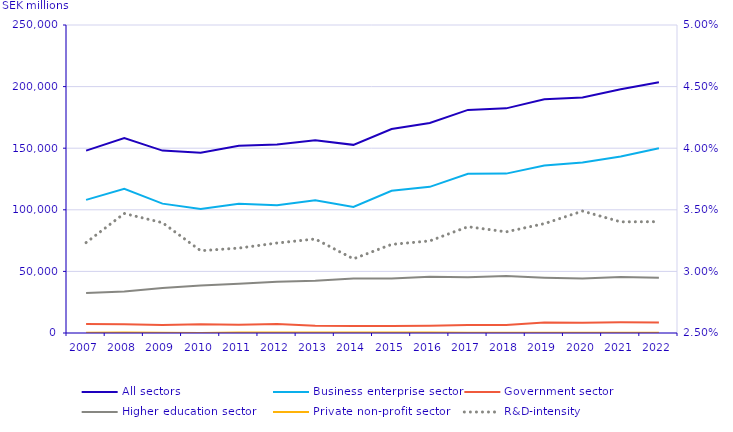
| Category | All sectors | Business enterprise sector | Government sector | Higher education sector | Private non-profit sector |
|---|---|---|---|---|---|
| 2007 | 148064.803 | 108048.556 | 7315.673 | 32453.731 | 246.844 |
| 2008 | 158165.206 | 117124.137 | 7023.628 | 33707.536 | 309.905 |
| 2009 | 148042.103 | 105006.653 | 6471.565 | 36454.263 | 109.621 |
| 2010 | 146349.97 | 100610.676 | 7129.595 | 38559.281 | 50.418 |
| 2011 | 152041.988 | 104949.767 | 6652.556 | 39956.261 | 483.404 |
| 2012 | 153093.454 | 103778.803 | 7352.629 | 41513.8 | 448.223 |
| 2013 | 156486.555 | 107806.951 | 5857.41 | 42470.925 | 351.269 |
| 2014 | 152707.249 | 102379.01 | 5721.22 | 44239.579 | 367.44 |
| 2015 | 165595.104 | 115399.439 | 5661.546 | 44227.436 | 306.682 |
| 2016 | 170507.534 | 118642.427 | 5804.81 | 45729.68 | 330.616 |
| 2017 | 181102.219 | 129170.926 | 6559.093 | 45156.785 | 215.415 |
| 2018 | 182342.868 | 129374.5 | 6594.323 | 46168.221 | 205.824 |
| 2019 | 189689.467 | 136008.434 | 8559.646 | 44900.714 | 220.672 |
| 2020 | 191161.528 | 138302.77 | 8403.17 | 44232.706 | 222.881 |
| 2021 | 197828.192 | 143319.51 | 8730.8 | 45552.14 | 225.742 |
| 2022 | 203524 | 149930 | 8567 | 44802 | 225 |